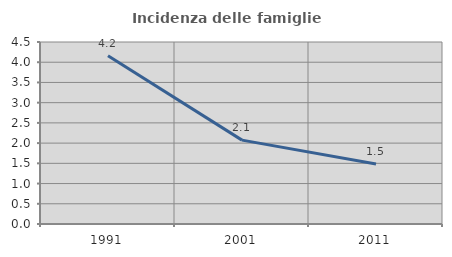
| Category | Incidenza delle famiglie numerose |
|---|---|
| 1991.0 | 4.162 |
| 2001.0 | 2.074 |
| 2011.0 | 1.483 |